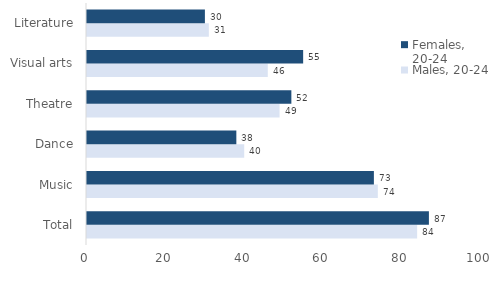
| Category | Males, 20-24 | Females, 20-24 |
|---|---|---|
| Total | 84 | 87 |
| Music | 74 | 73 |
| Dance | 40 | 38 |
| Theatre | 49 | 52 |
| Visual arts | 46 | 55 |
| Literature | 31 | 30 |